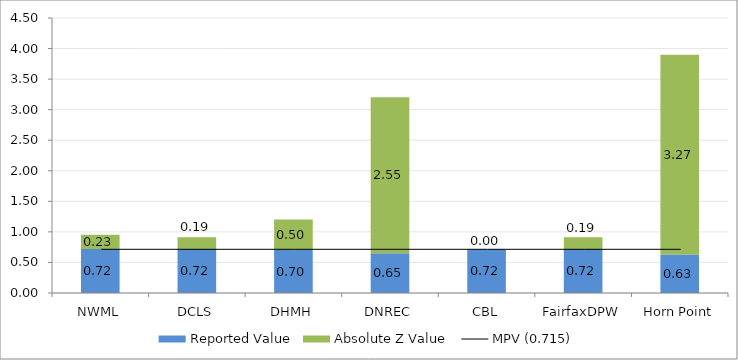
| Category | Reported Value | Absolute Z Value  |
|---|---|---|
| NWML | 0.721 | 0.231 |
| DCLS | 0.72 | 0.192 |
| DHMH | 0.702 | 0.5 |
| DNREC | 0.649 | 2.554 |
| CBL | 0.715 | 0 |
| FairfaxDPW | 0.72 | 0.192 |
| Horn Point | 0.63 | 3.269 |